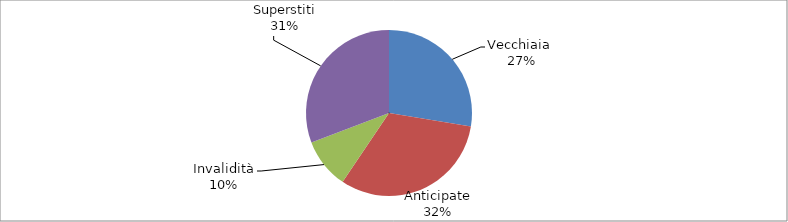
| Category | Series 0 |
|---|---|
| Vecchiaia  | 87205 |
| Anticipate | 100581 |
| Invalidità | 30971 |
| Superstiti | 97244 |